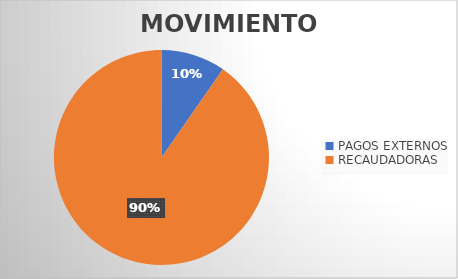
| Category | MOVIMIENTOS |
|---|---|
| PAGOS EXTERNOS | 9603 |
| RECAUDADORAS | 89622 |